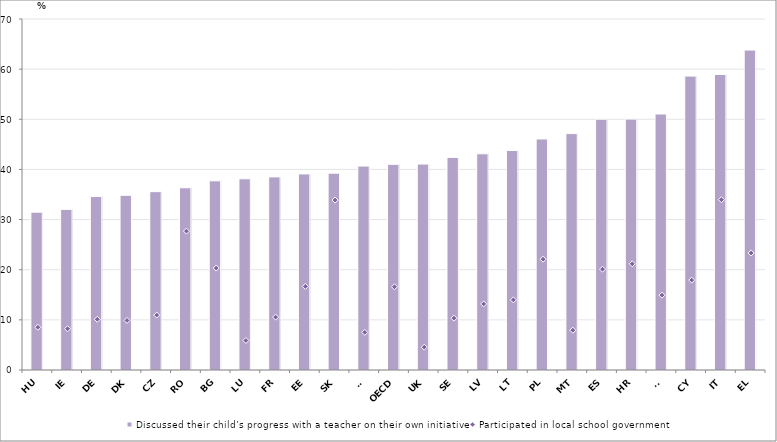
| Category | Discussed their child’s progress with a teacher on their own initiative |
|---|---|
| HU | 31.476 |
| IE | 32.031 |
| DE | 34.598 |
| DK | 34.837 |
| CZ | 35.569 |
| RO | 36.342 |
| BG | 37.725 |
| LU | 38.132 |
| FR | 38.509 |
| EE | 39.102 |
| SK | 39.256 |
| FI | 40.672 |
| OECD | 41.013 |
| UK | 41.072 |
| SE | 42.402 |
| LV | 43.119 |
| LT | 43.77 |
| PL | 46.079 |
| MT | 47.147 |
| ES | 50.023 |
| HR | 50.042 |
| SI | 51.054 |
| CY | 58.62 |
| IT | 58.932 |
| EL | 63.805 |